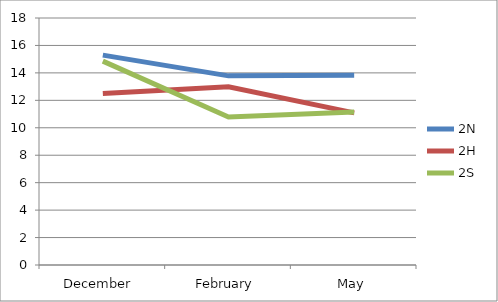
| Category | 2N | 2H | 2S  |
|---|---|---|---|
| December  | 15.295 | 12.5 | 14.857 |
| February | 13.784 | 12.989 | 10.786 |
| May | 13.833 | 11.083 | 11.152 |